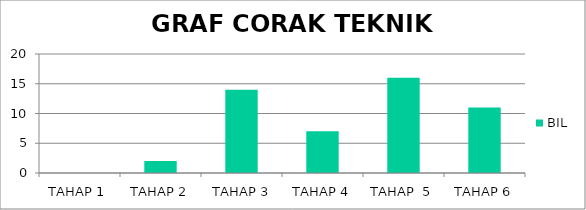
| Category | BIL |
|---|---|
| TAHAP 1 | 0 |
| TAHAP 2 | 2 |
|  TAHAP 3 | 14 |
| TAHAP 4 | 7 |
| TAHAP  5 | 16 |
| TAHAP 6 | 11 |